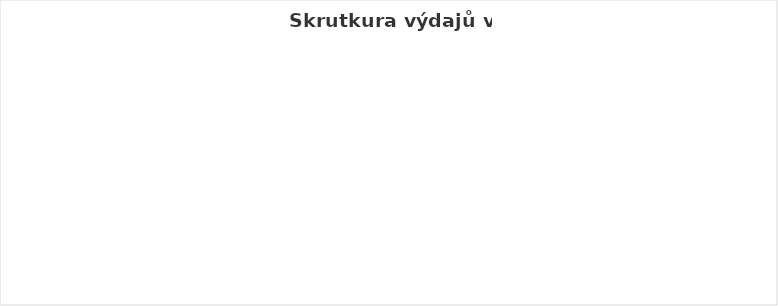
| Category | Series 0 |
|---|---|
| Osobní náklady celkem | 0 |
| Neinvestiční výdaje  | 0 |
| Kapitálové výdaje | 0 |
| Financování | 0 |